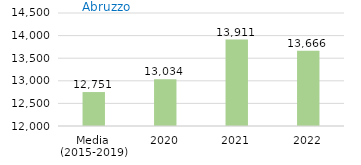
| Category | Series 0 |
|---|---|
| Media 
(2015-2019) | 12751 |
| 2020 | 13034 |
| 2021 | 13911 |
| 2022 | 13666 |